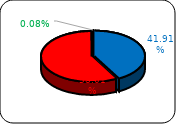
| Category | Series 0 |
|---|---|
| 0 | 4343213.69 |
| 1 | 6010771.36 |
| 2 | 8050.95 |